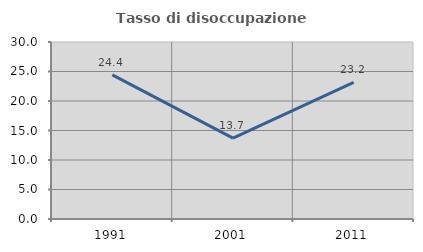
| Category | Tasso di disoccupazione giovanile  |
|---|---|
| 1991.0 | 24.434 |
| 2001.0 | 13.704 |
| 2011.0 | 23.167 |